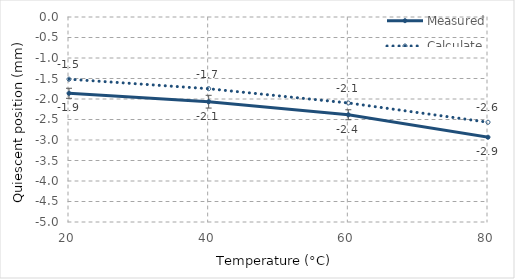
| Category | Measured | Calculated | test |
|---|---|---|---|
| 20.0 | -1.861 | -1.517 | 0.123 |
| 40.0 | -2.066 | -1.749 | 0.155 |
| 60.0 | -2.384 | -2.097 | 0.122 |
| 80.0 | -2.932 | -2.567 | 0.13 |